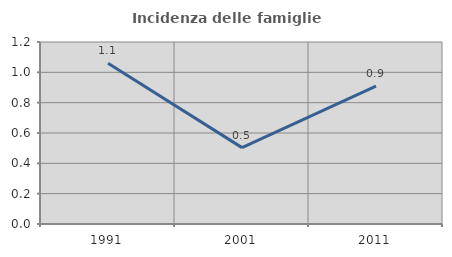
| Category | Incidenza delle famiglie numerose |
|---|---|
| 1991.0 | 1.06 |
| 2001.0 | 0.504 |
| 2011.0 | 0.91 |